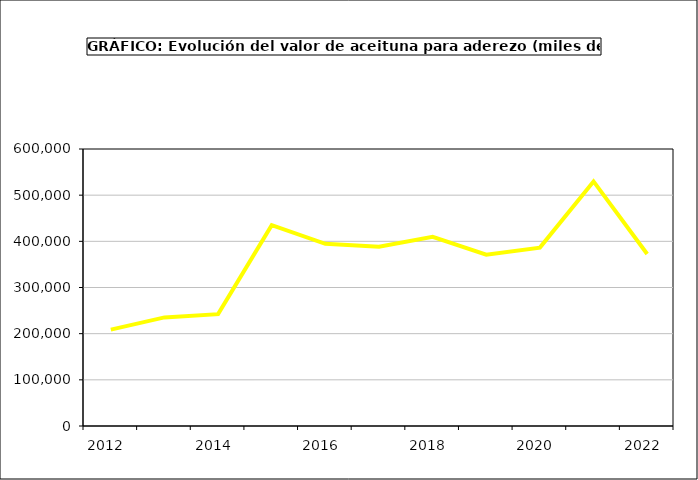
| Category | producción |
|---|---|
| 2012.0 | 208668.687 |
| 2013.0 | 235213.576 |
| 2014.0 | 242272.525 |
| 2015.0 | 434946 |
| 2016.0 | 394686 |
| 2017.0 | 388313.865 |
| 2018.0 | 409725.361 |
| 2019.0 | 371208.518 |
| 2020.0 | 386355.608 |
| 2021.0 | 529810.238 |
| 2022.0 | 372498.173 |